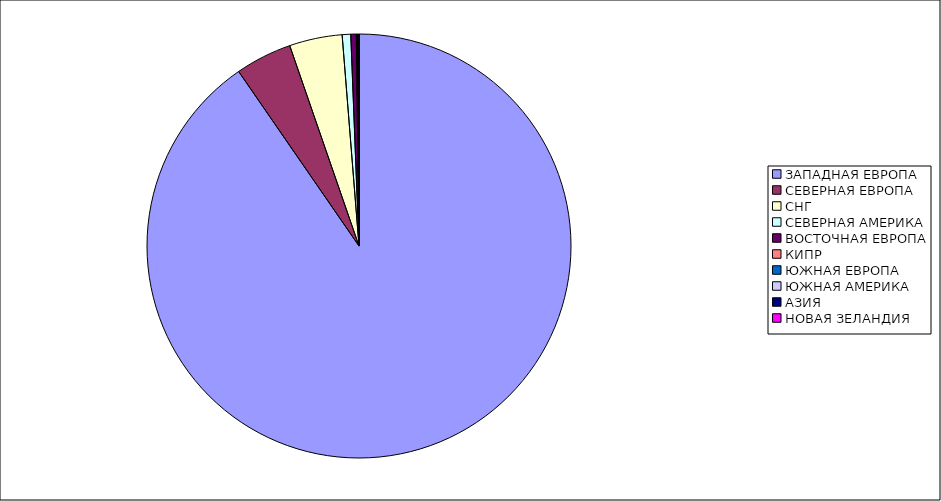
| Category | Оборот |
|---|---|
| ЗАПАДНАЯ ЕВРОПА | 0.904 |
| СЕВЕРНАЯ ЕВРОПА | 0.043 |
| СНГ | 0.04 |
| СЕВЕРНАЯ АМЕРИКА | 0.007 |
| ВОСТОЧНАЯ ЕВРОПА | 0.004 |
| КИПР | 0.001 |
| ЮЖНАЯ ЕВРОПА | 0.001 |
| ЮЖНАЯ АМЕРИКА | 0 |
| АЗИЯ | 0 |
| НОВАЯ ЗЕЛАНДИЯ | 0 |